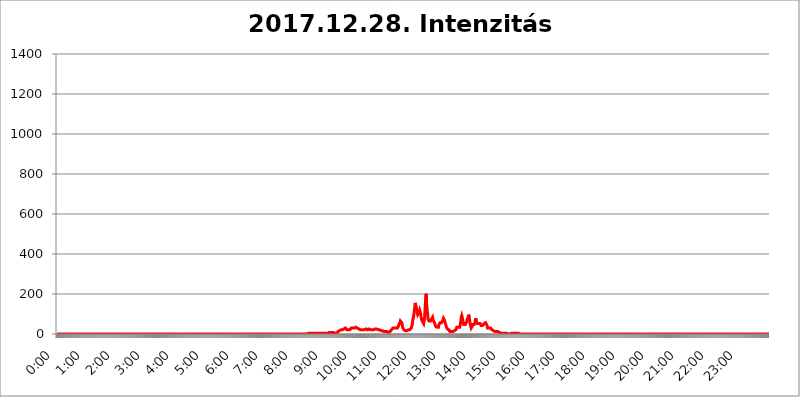
| Category | 2017.12.28. Intenzitás [W/m^2] |
|---|---|
| 0.0 | 0 |
| 0.0006944444444444445 | 0 |
| 0.001388888888888889 | 0 |
| 0.0020833333333333333 | 0 |
| 0.002777777777777778 | 0 |
| 0.003472222222222222 | 0 |
| 0.004166666666666667 | 0 |
| 0.004861111111111111 | 0 |
| 0.005555555555555556 | 0 |
| 0.0062499999999999995 | 0 |
| 0.006944444444444444 | 0 |
| 0.007638888888888889 | 0 |
| 0.008333333333333333 | 0 |
| 0.009027777777777779 | 0 |
| 0.009722222222222222 | 0 |
| 0.010416666666666666 | 0 |
| 0.011111111111111112 | 0 |
| 0.011805555555555555 | 0 |
| 0.012499999999999999 | 0 |
| 0.013194444444444444 | 0 |
| 0.013888888888888888 | 0 |
| 0.014583333333333332 | 0 |
| 0.015277777777777777 | 0 |
| 0.015972222222222224 | 0 |
| 0.016666666666666666 | 0 |
| 0.017361111111111112 | 0 |
| 0.018055555555555557 | 0 |
| 0.01875 | 0 |
| 0.019444444444444445 | 0 |
| 0.02013888888888889 | 0 |
| 0.020833333333333332 | 0 |
| 0.02152777777777778 | 0 |
| 0.022222222222222223 | 0 |
| 0.02291666666666667 | 0 |
| 0.02361111111111111 | 0 |
| 0.024305555555555556 | 0 |
| 0.024999999999999998 | 0 |
| 0.025694444444444447 | 0 |
| 0.02638888888888889 | 0 |
| 0.027083333333333334 | 0 |
| 0.027777777777777776 | 0 |
| 0.02847222222222222 | 0 |
| 0.029166666666666664 | 0 |
| 0.029861111111111113 | 0 |
| 0.030555555555555555 | 0 |
| 0.03125 | 0 |
| 0.03194444444444445 | 0 |
| 0.03263888888888889 | 0 |
| 0.03333333333333333 | 0 |
| 0.034027777777777775 | 0 |
| 0.034722222222222224 | 0 |
| 0.035416666666666666 | 0 |
| 0.036111111111111115 | 0 |
| 0.03680555555555556 | 0 |
| 0.0375 | 0 |
| 0.03819444444444444 | 0 |
| 0.03888888888888889 | 0 |
| 0.03958333333333333 | 0 |
| 0.04027777777777778 | 0 |
| 0.04097222222222222 | 0 |
| 0.041666666666666664 | 0 |
| 0.042361111111111106 | 0 |
| 0.04305555555555556 | 0 |
| 0.043750000000000004 | 0 |
| 0.044444444444444446 | 0 |
| 0.04513888888888889 | 0 |
| 0.04583333333333334 | 0 |
| 0.04652777777777778 | 0 |
| 0.04722222222222222 | 0 |
| 0.04791666666666666 | 0 |
| 0.04861111111111111 | 0 |
| 0.049305555555555554 | 0 |
| 0.049999999999999996 | 0 |
| 0.05069444444444445 | 0 |
| 0.051388888888888894 | 0 |
| 0.052083333333333336 | 0 |
| 0.05277777777777778 | 0 |
| 0.05347222222222222 | 0 |
| 0.05416666666666667 | 0 |
| 0.05486111111111111 | 0 |
| 0.05555555555555555 | 0 |
| 0.05625 | 0 |
| 0.05694444444444444 | 0 |
| 0.057638888888888885 | 0 |
| 0.05833333333333333 | 0 |
| 0.05902777777777778 | 0 |
| 0.059722222222222225 | 0 |
| 0.06041666666666667 | 0 |
| 0.061111111111111116 | 0 |
| 0.06180555555555556 | 0 |
| 0.0625 | 0 |
| 0.06319444444444444 | 0 |
| 0.06388888888888888 | 0 |
| 0.06458333333333334 | 0 |
| 0.06527777777777778 | 0 |
| 0.06597222222222222 | 0 |
| 0.06666666666666667 | 0 |
| 0.06736111111111111 | 0 |
| 0.06805555555555555 | 0 |
| 0.06874999999999999 | 0 |
| 0.06944444444444443 | 0 |
| 0.07013888888888889 | 0 |
| 0.07083333333333333 | 0 |
| 0.07152777777777779 | 0 |
| 0.07222222222222223 | 0 |
| 0.07291666666666667 | 0 |
| 0.07361111111111111 | 0 |
| 0.07430555555555556 | 0 |
| 0.075 | 0 |
| 0.07569444444444444 | 0 |
| 0.0763888888888889 | 0 |
| 0.07708333333333334 | 0 |
| 0.07777777777777778 | 0 |
| 0.07847222222222222 | 0 |
| 0.07916666666666666 | 0 |
| 0.0798611111111111 | 0 |
| 0.08055555555555556 | 0 |
| 0.08125 | 0 |
| 0.08194444444444444 | 0 |
| 0.08263888888888889 | 0 |
| 0.08333333333333333 | 0 |
| 0.08402777777777777 | 0 |
| 0.08472222222222221 | 0 |
| 0.08541666666666665 | 0 |
| 0.08611111111111112 | 0 |
| 0.08680555555555557 | 0 |
| 0.08750000000000001 | 0 |
| 0.08819444444444445 | 0 |
| 0.08888888888888889 | 0 |
| 0.08958333333333333 | 0 |
| 0.09027777777777778 | 0 |
| 0.09097222222222222 | 0 |
| 0.09166666666666667 | 0 |
| 0.09236111111111112 | 0 |
| 0.09305555555555556 | 0 |
| 0.09375 | 0 |
| 0.09444444444444444 | 0 |
| 0.09513888888888888 | 0 |
| 0.09583333333333333 | 0 |
| 0.09652777777777777 | 0 |
| 0.09722222222222222 | 0 |
| 0.09791666666666667 | 0 |
| 0.09861111111111111 | 0 |
| 0.09930555555555555 | 0 |
| 0.09999999999999999 | 0 |
| 0.10069444444444443 | 0 |
| 0.1013888888888889 | 0 |
| 0.10208333333333335 | 0 |
| 0.10277777777777779 | 0 |
| 0.10347222222222223 | 0 |
| 0.10416666666666667 | 0 |
| 0.10486111111111111 | 0 |
| 0.10555555555555556 | 0 |
| 0.10625 | 0 |
| 0.10694444444444444 | 0 |
| 0.1076388888888889 | 0 |
| 0.10833333333333334 | 0 |
| 0.10902777777777778 | 0 |
| 0.10972222222222222 | 0 |
| 0.1111111111111111 | 0 |
| 0.11180555555555556 | 0 |
| 0.11180555555555556 | 0 |
| 0.1125 | 0 |
| 0.11319444444444444 | 0 |
| 0.11388888888888889 | 0 |
| 0.11458333333333333 | 0 |
| 0.11527777777777777 | 0 |
| 0.11597222222222221 | 0 |
| 0.11666666666666665 | 0 |
| 0.1173611111111111 | 0 |
| 0.11805555555555557 | 0 |
| 0.11944444444444445 | 0 |
| 0.12013888888888889 | 0 |
| 0.12083333333333333 | 0 |
| 0.12152777777777778 | 0 |
| 0.12222222222222223 | 0 |
| 0.12291666666666667 | 0 |
| 0.12291666666666667 | 0 |
| 0.12361111111111112 | 0 |
| 0.12430555555555556 | 0 |
| 0.125 | 0 |
| 0.12569444444444444 | 0 |
| 0.12638888888888888 | 0 |
| 0.12708333333333333 | 0 |
| 0.16875 | 0 |
| 0.12847222222222224 | 0 |
| 0.12916666666666668 | 0 |
| 0.12986111111111112 | 0 |
| 0.13055555555555556 | 0 |
| 0.13125 | 0 |
| 0.13194444444444445 | 0 |
| 0.1326388888888889 | 0 |
| 0.13333333333333333 | 0 |
| 0.13402777777777777 | 0 |
| 0.13402777777777777 | 0 |
| 0.13472222222222222 | 0 |
| 0.13541666666666666 | 0 |
| 0.1361111111111111 | 0 |
| 0.13749999999999998 | 0 |
| 0.13819444444444443 | 0 |
| 0.1388888888888889 | 0 |
| 0.13958333333333334 | 0 |
| 0.14027777777777778 | 0 |
| 0.14097222222222222 | 0 |
| 0.14166666666666666 | 0 |
| 0.1423611111111111 | 0 |
| 0.14305555555555557 | 0 |
| 0.14375000000000002 | 0 |
| 0.14444444444444446 | 0 |
| 0.1451388888888889 | 0 |
| 0.1451388888888889 | 0 |
| 0.14652777777777778 | 0 |
| 0.14722222222222223 | 0 |
| 0.14791666666666667 | 0 |
| 0.1486111111111111 | 0 |
| 0.14930555555555555 | 0 |
| 0.15 | 0 |
| 0.15069444444444444 | 0 |
| 0.15138888888888888 | 0 |
| 0.15208333333333332 | 0 |
| 0.15277777777777776 | 0 |
| 0.15347222222222223 | 0 |
| 0.15416666666666667 | 0 |
| 0.15486111111111112 | 0 |
| 0.15555555555555556 | 0 |
| 0.15625 | 0 |
| 0.15694444444444444 | 0 |
| 0.15763888888888888 | 0 |
| 0.15833333333333333 | 0 |
| 0.15902777777777777 | 0 |
| 0.15972222222222224 | 0 |
| 0.16041666666666668 | 0 |
| 0.16111111111111112 | 0 |
| 0.16180555555555556 | 0 |
| 0.1625 | 0 |
| 0.16319444444444445 | 0 |
| 0.1638888888888889 | 0 |
| 0.16458333333333333 | 0 |
| 0.16527777777777777 | 0 |
| 0.16597222222222222 | 0 |
| 0.16666666666666666 | 0 |
| 0.1673611111111111 | 0 |
| 0.16805555555555554 | 0 |
| 0.16874999999999998 | 0 |
| 0.16944444444444443 | 0 |
| 0.17013888888888887 | 0 |
| 0.1708333333333333 | 0 |
| 0.17152777777777775 | 0 |
| 0.17222222222222225 | 0 |
| 0.1729166666666667 | 0 |
| 0.17361111111111113 | 0 |
| 0.17430555555555557 | 0 |
| 0.17500000000000002 | 0 |
| 0.17569444444444446 | 0 |
| 0.1763888888888889 | 0 |
| 0.17708333333333334 | 0 |
| 0.17777777777777778 | 0 |
| 0.17847222222222223 | 0 |
| 0.17916666666666667 | 0 |
| 0.1798611111111111 | 0 |
| 0.18055555555555555 | 0 |
| 0.18125 | 0 |
| 0.18194444444444444 | 0 |
| 0.1826388888888889 | 0 |
| 0.18333333333333335 | 0 |
| 0.1840277777777778 | 0 |
| 0.18472222222222223 | 0 |
| 0.18541666666666667 | 0 |
| 0.18611111111111112 | 0 |
| 0.18680555555555556 | 0 |
| 0.1875 | 0 |
| 0.18819444444444444 | 0 |
| 0.18888888888888888 | 0 |
| 0.18958333333333333 | 0 |
| 0.19027777777777777 | 0 |
| 0.1909722222222222 | 0 |
| 0.19166666666666665 | 0 |
| 0.19236111111111112 | 0 |
| 0.19305555555555554 | 0 |
| 0.19375 | 0 |
| 0.19444444444444445 | 0 |
| 0.1951388888888889 | 0 |
| 0.19583333333333333 | 0 |
| 0.19652777777777777 | 0 |
| 0.19722222222222222 | 0 |
| 0.19791666666666666 | 0 |
| 0.1986111111111111 | 0 |
| 0.19930555555555554 | 0 |
| 0.19999999999999998 | 0 |
| 0.20069444444444443 | 0 |
| 0.20138888888888887 | 0 |
| 0.2020833333333333 | 0 |
| 0.2027777777777778 | 0 |
| 0.2034722222222222 | 0 |
| 0.2041666666666667 | 0 |
| 0.20486111111111113 | 0 |
| 0.20555555555555557 | 0 |
| 0.20625000000000002 | 0 |
| 0.20694444444444446 | 0 |
| 0.2076388888888889 | 0 |
| 0.20833333333333334 | 0 |
| 0.20902777777777778 | 0 |
| 0.20972222222222223 | 0 |
| 0.21041666666666667 | 0 |
| 0.2111111111111111 | 0 |
| 0.21180555555555555 | 0 |
| 0.2125 | 0 |
| 0.21319444444444444 | 0 |
| 0.2138888888888889 | 0 |
| 0.21458333333333335 | 0 |
| 0.2152777777777778 | 0 |
| 0.21597222222222223 | 0 |
| 0.21666666666666667 | 0 |
| 0.21736111111111112 | 0 |
| 0.21805555555555556 | 0 |
| 0.21875 | 0 |
| 0.21944444444444444 | 0 |
| 0.22013888888888888 | 0 |
| 0.22083333333333333 | 0 |
| 0.22152777777777777 | 0 |
| 0.2222222222222222 | 0 |
| 0.22291666666666665 | 0 |
| 0.2236111111111111 | 0 |
| 0.22430555555555556 | 0 |
| 0.225 | 0 |
| 0.22569444444444445 | 0 |
| 0.2263888888888889 | 0 |
| 0.22708333333333333 | 0 |
| 0.22777777777777777 | 0 |
| 0.22847222222222222 | 0 |
| 0.22916666666666666 | 0 |
| 0.2298611111111111 | 0 |
| 0.23055555555555554 | 0 |
| 0.23124999999999998 | 0 |
| 0.23194444444444443 | 0 |
| 0.23263888888888887 | 0 |
| 0.2333333333333333 | 0 |
| 0.2340277777777778 | 0 |
| 0.2347222222222222 | 0 |
| 0.2354166666666667 | 0 |
| 0.23611111111111113 | 0 |
| 0.23680555555555557 | 0 |
| 0.23750000000000002 | 0 |
| 0.23819444444444446 | 0 |
| 0.2388888888888889 | 0 |
| 0.23958333333333334 | 0 |
| 0.24027777777777778 | 0 |
| 0.24097222222222223 | 0 |
| 0.24166666666666667 | 0 |
| 0.2423611111111111 | 0 |
| 0.24305555555555555 | 0 |
| 0.24375 | 0 |
| 0.24444444444444446 | 0 |
| 0.24513888888888888 | 0 |
| 0.24583333333333335 | 0 |
| 0.2465277777777778 | 0 |
| 0.24722222222222223 | 0 |
| 0.24791666666666667 | 0 |
| 0.24861111111111112 | 0 |
| 0.24930555555555556 | 0 |
| 0.25 | 0 |
| 0.25069444444444444 | 0 |
| 0.2513888888888889 | 0 |
| 0.2520833333333333 | 0 |
| 0.25277777777777777 | 0 |
| 0.2534722222222222 | 0 |
| 0.25416666666666665 | 0 |
| 0.2548611111111111 | 0 |
| 0.2555555555555556 | 0 |
| 0.25625000000000003 | 0 |
| 0.2569444444444445 | 0 |
| 0.2576388888888889 | 0 |
| 0.25833333333333336 | 0 |
| 0.2590277777777778 | 0 |
| 0.25972222222222224 | 0 |
| 0.2604166666666667 | 0 |
| 0.2611111111111111 | 0 |
| 0.26180555555555557 | 0 |
| 0.2625 | 0 |
| 0.26319444444444445 | 0 |
| 0.2638888888888889 | 0 |
| 0.26458333333333334 | 0 |
| 0.2652777777777778 | 0 |
| 0.2659722222222222 | 0 |
| 0.26666666666666666 | 0 |
| 0.2673611111111111 | 0 |
| 0.26805555555555555 | 0 |
| 0.26875 | 0 |
| 0.26944444444444443 | 0 |
| 0.2701388888888889 | 0 |
| 0.2708333333333333 | 0 |
| 0.27152777777777776 | 0 |
| 0.2722222222222222 | 0 |
| 0.27291666666666664 | 0 |
| 0.2736111111111111 | 0 |
| 0.2743055555555555 | 0 |
| 0.27499999999999997 | 0 |
| 0.27569444444444446 | 0 |
| 0.27638888888888885 | 0 |
| 0.27708333333333335 | 0 |
| 0.2777777777777778 | 0 |
| 0.27847222222222223 | 0 |
| 0.2791666666666667 | 0 |
| 0.2798611111111111 | 0 |
| 0.28055555555555556 | 0 |
| 0.28125 | 0 |
| 0.28194444444444444 | 0 |
| 0.2826388888888889 | 0 |
| 0.2833333333333333 | 0 |
| 0.28402777777777777 | 0 |
| 0.2847222222222222 | 0 |
| 0.28541666666666665 | 0 |
| 0.28611111111111115 | 0 |
| 0.28680555555555554 | 0 |
| 0.28750000000000003 | 0 |
| 0.2881944444444445 | 0 |
| 0.2888888888888889 | 0 |
| 0.28958333333333336 | 0 |
| 0.2902777777777778 | 0 |
| 0.29097222222222224 | 0 |
| 0.2916666666666667 | 0 |
| 0.2923611111111111 | 0 |
| 0.29305555555555557 | 0 |
| 0.29375 | 0 |
| 0.29444444444444445 | 0 |
| 0.2951388888888889 | 0 |
| 0.29583333333333334 | 0 |
| 0.2965277777777778 | 0 |
| 0.2972222222222222 | 0 |
| 0.29791666666666666 | 0 |
| 0.2986111111111111 | 0 |
| 0.29930555555555555 | 0 |
| 0.3 | 0 |
| 0.30069444444444443 | 0 |
| 0.3013888888888889 | 0 |
| 0.3020833333333333 | 0 |
| 0.30277777777777776 | 0 |
| 0.3034722222222222 | 0 |
| 0.30416666666666664 | 0 |
| 0.3048611111111111 | 0 |
| 0.3055555555555555 | 0 |
| 0.30624999999999997 | 0 |
| 0.3069444444444444 | 0 |
| 0.3076388888888889 | 0 |
| 0.30833333333333335 | 0 |
| 0.3090277777777778 | 0 |
| 0.30972222222222223 | 0 |
| 0.3104166666666667 | 0 |
| 0.3111111111111111 | 0 |
| 0.31180555555555556 | 0 |
| 0.3125 | 0 |
| 0.31319444444444444 | 0 |
| 0.3138888888888889 | 0 |
| 0.3145833333333333 | 0 |
| 0.31527777777777777 | 0 |
| 0.3159722222222222 | 0 |
| 0.31666666666666665 | 0 |
| 0.31736111111111115 | 0 |
| 0.31805555555555554 | 0 |
| 0.31875000000000003 | 0 |
| 0.3194444444444445 | 0 |
| 0.3201388888888889 | 0 |
| 0.32083333333333336 | 0 |
| 0.3215277777777778 | 0 |
| 0.32222222222222224 | 0 |
| 0.3229166666666667 | 0 |
| 0.3236111111111111 | 0 |
| 0.32430555555555557 | 0 |
| 0.325 | 0 |
| 0.32569444444444445 | 0 |
| 0.3263888888888889 | 0 |
| 0.32708333333333334 | 0 |
| 0.3277777777777778 | 0 |
| 0.3284722222222222 | 0 |
| 0.32916666666666666 | 0 |
| 0.3298611111111111 | 0 |
| 0.33055555555555555 | 0 |
| 0.33125 | 0 |
| 0.33194444444444443 | 0 |
| 0.3326388888888889 | 0 |
| 0.3333333333333333 | 0 |
| 0.3340277777777778 | 0 |
| 0.3347222222222222 | 0 |
| 0.3354166666666667 | 0 |
| 0.3361111111111111 | 0 |
| 0.3368055555555556 | 0 |
| 0.33749999999999997 | 0 |
| 0.33819444444444446 | 0 |
| 0.33888888888888885 | 0 |
| 0.33958333333333335 | 0 |
| 0.34027777777777773 | 0 |
| 0.34097222222222223 | 0 |
| 0.3416666666666666 | 0 |
| 0.3423611111111111 | 0 |
| 0.3430555555555555 | 0 |
| 0.34375 | 0 |
| 0.3444444444444445 | 0 |
| 0.3451388888888889 | 0 |
| 0.3458333333333334 | 0 |
| 0.34652777777777777 | 0 |
| 0.34722222222222227 | 0 |
| 0.34791666666666665 | 0 |
| 0.34861111111111115 | 0 |
| 0.34930555555555554 | 0 |
| 0.35000000000000003 | 0 |
| 0.3506944444444444 | 0 |
| 0.3513888888888889 | 0 |
| 0.3520833333333333 | 3.525 |
| 0.3527777777777778 | 3.525 |
| 0.3534722222222222 | 3.525 |
| 0.3541666666666667 | 3.525 |
| 0.3548611111111111 | 3.525 |
| 0.35555555555555557 | 3.525 |
| 0.35625 | 3.525 |
| 0.35694444444444445 | 3.525 |
| 0.3576388888888889 | 3.525 |
| 0.35833333333333334 | 3.525 |
| 0.3590277777777778 | 3.525 |
| 0.3597222222222222 | 3.525 |
| 0.36041666666666666 | 3.525 |
| 0.3611111111111111 | 3.525 |
| 0.36180555555555555 | 3.525 |
| 0.3625 | 3.525 |
| 0.36319444444444443 | 3.525 |
| 0.3638888888888889 | 3.525 |
| 0.3645833333333333 | 3.525 |
| 0.3652777777777778 | 3.525 |
| 0.3659722222222222 | 3.525 |
| 0.3666666666666667 | 3.525 |
| 0.3673611111111111 | 3.525 |
| 0.3680555555555556 | 3.525 |
| 0.36874999999999997 | 3.525 |
| 0.36944444444444446 | 3.525 |
| 0.37013888888888885 | 3.525 |
| 0.37083333333333335 | 3.525 |
| 0.37152777777777773 | 3.525 |
| 0.37222222222222223 | 3.525 |
| 0.3729166666666666 | 3.525 |
| 0.3736111111111111 | 3.525 |
| 0.3743055555555555 | 3.525 |
| 0.375 | 3.525 |
| 0.3756944444444445 | 7.887 |
| 0.3763888888888889 | 3.525 |
| 0.3770833333333334 | 3.525 |
| 0.37777777777777777 | 3.525 |
| 0.37847222222222227 | 3.525 |
| 0.37916666666666665 | 3.525 |
| 0.37986111111111115 | 3.525 |
| 0.38055555555555554 | 7.887 |
| 0.38125000000000003 | 7.887 |
| 0.3819444444444444 | 7.887 |
| 0.3826388888888889 | 7.887 |
| 0.3833333333333333 | 7.887 |
| 0.3840277777777778 | 7.887 |
| 0.3847222222222222 | 7.887 |
| 0.3854166666666667 | 7.887 |
| 0.3861111111111111 | 7.887 |
| 0.38680555555555557 | 7.887 |
| 0.3875 | 7.887 |
| 0.38819444444444445 | 7.887 |
| 0.3888888888888889 | 3.525 |
| 0.38958333333333334 | 3.525 |
| 0.3902777777777778 | 3.525 |
| 0.3909722222222222 | 3.525 |
| 0.39166666666666666 | 3.525 |
| 0.3923611111111111 | 3.525 |
| 0.39305555555555555 | 7.887 |
| 0.39375 | 12.257 |
| 0.39444444444444443 | 12.257 |
| 0.3951388888888889 | 12.257 |
| 0.3958333333333333 | 16.636 |
| 0.3965277777777778 | 16.636 |
| 0.3972222222222222 | 16.636 |
| 0.3979166666666667 | 21.024 |
| 0.3986111111111111 | 21.024 |
| 0.3993055555555556 | 21.024 |
| 0.39999999999999997 | 21.024 |
| 0.40069444444444446 | 21.024 |
| 0.40138888888888885 | 25.419 |
| 0.40208333333333335 | 25.419 |
| 0.40277777777777773 | 29.823 |
| 0.40347222222222223 | 29.823 |
| 0.4041666666666666 | 29.823 |
| 0.4048611111111111 | 25.419 |
| 0.4055555555555555 | 25.419 |
| 0.40625 | 21.024 |
| 0.4069444444444445 | 21.024 |
| 0.4076388888888889 | 21.024 |
| 0.4083333333333334 | 21.024 |
| 0.40902777777777777 | 21.024 |
| 0.40972222222222227 | 21.024 |
| 0.41041666666666665 | 21.024 |
| 0.41111111111111115 | 25.419 |
| 0.41180555555555554 | 25.419 |
| 0.41250000000000003 | 29.823 |
| 0.4131944444444444 | 29.823 |
| 0.4138888888888889 | 29.823 |
| 0.4145833333333333 | 29.823 |
| 0.4152777777777778 | 34.234 |
| 0.4159722222222222 | 34.234 |
| 0.4166666666666667 | 29.823 |
| 0.4173611111111111 | 29.823 |
| 0.41805555555555557 | 34.234 |
| 0.41875 | 34.234 |
| 0.41944444444444445 | 34.234 |
| 0.4201388888888889 | 34.234 |
| 0.42083333333333334 | 29.823 |
| 0.4215277777777778 | 29.823 |
| 0.4222222222222222 | 25.419 |
| 0.42291666666666666 | 25.419 |
| 0.4236111111111111 | 25.419 |
| 0.42430555555555555 | 21.024 |
| 0.425 | 21.024 |
| 0.42569444444444443 | 21.024 |
| 0.4263888888888889 | 21.024 |
| 0.4270833333333333 | 21.024 |
| 0.4277777777777778 | 21.024 |
| 0.4284722222222222 | 21.024 |
| 0.4291666666666667 | 21.024 |
| 0.4298611111111111 | 21.024 |
| 0.4305555555555556 | 16.636 |
| 0.43124999999999997 | 21.024 |
| 0.43194444444444446 | 21.024 |
| 0.43263888888888885 | 21.024 |
| 0.43333333333333335 | 25.419 |
| 0.43402777777777773 | 25.419 |
| 0.43472222222222223 | 25.419 |
| 0.4354166666666666 | 21.024 |
| 0.4361111111111111 | 25.419 |
| 0.4368055555555555 | 25.419 |
| 0.4375 | 25.419 |
| 0.4381944444444445 | 25.419 |
| 0.4388888888888889 | 25.419 |
| 0.4395833333333334 | 21.024 |
| 0.44027777777777777 | 21.024 |
| 0.44097222222222227 | 25.419 |
| 0.44166666666666665 | 21.024 |
| 0.44236111111111115 | 21.024 |
| 0.44305555555555554 | 21.024 |
| 0.44375000000000003 | 21.024 |
| 0.4444444444444444 | 21.024 |
| 0.4451388888888889 | 25.419 |
| 0.4458333333333333 | 25.419 |
| 0.4465277777777778 | 25.419 |
| 0.4472222222222222 | 25.419 |
| 0.4479166666666667 | 25.419 |
| 0.4486111111111111 | 21.024 |
| 0.44930555555555557 | 21.024 |
| 0.45 | 21.024 |
| 0.45069444444444445 | 21.024 |
| 0.4513888888888889 | 21.024 |
| 0.45208333333333334 | 21.024 |
| 0.4527777777777778 | 21.024 |
| 0.4534722222222222 | 21.024 |
| 0.45416666666666666 | 16.636 |
| 0.4548611111111111 | 16.636 |
| 0.45555555555555555 | 12.257 |
| 0.45625 | 16.636 |
| 0.45694444444444443 | 16.636 |
| 0.4576388888888889 | 12.257 |
| 0.4583333333333333 | 12.257 |
| 0.4590277777777778 | 12.257 |
| 0.4597222222222222 | 12.257 |
| 0.4604166666666667 | 12.257 |
| 0.4611111111111111 | 12.257 |
| 0.4618055555555556 | 12.257 |
| 0.46249999999999997 | 12.257 |
| 0.46319444444444446 | 7.887 |
| 0.46388888888888885 | 7.887 |
| 0.46458333333333335 | 7.887 |
| 0.46527777777777773 | 12.257 |
| 0.46597222222222223 | 12.257 |
| 0.4666666666666666 | 12.257 |
| 0.4673611111111111 | 16.636 |
| 0.4680555555555555 | 16.636 |
| 0.46875 | 21.024 |
| 0.4694444444444445 | 21.024 |
| 0.4701388888888889 | 25.419 |
| 0.4708333333333334 | 29.823 |
| 0.47152777777777777 | 29.823 |
| 0.47222222222222227 | 29.823 |
| 0.47291666666666665 | 29.823 |
| 0.47361111111111115 | 29.823 |
| 0.47430555555555554 | 29.823 |
| 0.47500000000000003 | 29.823 |
| 0.4756944444444444 | 29.823 |
| 0.4763888888888889 | 29.823 |
| 0.4770833333333333 | 29.823 |
| 0.4777777777777778 | 34.234 |
| 0.4784722222222222 | 38.653 |
| 0.4791666666666667 | 47.511 |
| 0.4798611111111111 | 51.951 |
| 0.48055555555555557 | 56.398 |
| 0.48125 | 65.31 |
| 0.48194444444444445 | 69.775 |
| 0.4826388888888889 | 69.775 |
| 0.48333333333333334 | 56.398 |
| 0.4840277777777778 | 43.079 |
| 0.4847222222222222 | 29.823 |
| 0.48541666666666666 | 25.419 |
| 0.4861111111111111 | 21.024 |
| 0.48680555555555555 | 21.024 |
| 0.4875 | 16.636 |
| 0.48819444444444443 | 16.636 |
| 0.4888888888888889 | 16.636 |
| 0.4895833333333333 | 12.257 |
| 0.4902777777777778 | 16.636 |
| 0.4909722222222222 | 16.636 |
| 0.4916666666666667 | 16.636 |
| 0.4923611111111111 | 21.024 |
| 0.4930555555555556 | 21.024 |
| 0.49374999999999997 | 21.024 |
| 0.49444444444444446 | 21.024 |
| 0.49513888888888885 | 21.024 |
| 0.49583333333333335 | 25.419 |
| 0.49652777777777773 | 29.823 |
| 0.49722222222222223 | 29.823 |
| 0.4979166666666666 | 47.511 |
| 0.4986111111111111 | 69.775 |
| 0.4993055555555555 | 78.722 |
| 0.5 | 92.184 |
| 0.5006944444444444 | 110.201 |
| 0.5013888888888889 | 137.347 |
| 0.5020833333333333 | 155.509 |
| 0.5027777777777778 | 160.056 |
| 0.5034722222222222 | 155.509 |
| 0.5041666666666667 | 119.235 |
| 0.5048611111111111 | 105.69 |
| 0.5055555555555555 | 96.682 |
| 0.50625 | 92.184 |
| 0.5069444444444444 | 92.184 |
| 0.5076388888888889 | 110.201 |
| 0.5083333333333333 | 119.235 |
| 0.5090277777777777 | 114.716 |
| 0.5097222222222222 | 101.184 |
| 0.5104166666666666 | 83.205 |
| 0.5111111111111112 | 69.775 |
| 0.5118055555555555 | 65.31 |
| 0.5125000000000001 | 60.85 |
| 0.5131944444444444 | 56.398 |
| 0.513888888888889 | 51.951 |
| 0.5145833333333333 | 56.398 |
| 0.5152777777777778 | 83.205 |
| 0.5159722222222222 | 132.814 |
| 0.5166666666666667 | 173.709 |
| 0.517361111111111 | 201.058 |
| 0.5180555555555556 | 150.964 |
| 0.5187499999999999 | 123.758 |
| 0.5194444444444445 | 96.682 |
| 0.5201388888888888 | 74.246 |
| 0.5208333333333334 | 69.775 |
| 0.5215277777777778 | 65.31 |
| 0.5222222222222223 | 65.31 |
| 0.5229166666666667 | 65.31 |
| 0.5236111111111111 | 65.31 |
| 0.5243055555555556 | 69.775 |
| 0.525 | 74.246 |
| 0.5256944444444445 | 78.722 |
| 0.5263888888888889 | 83.205 |
| 0.5270833333333333 | 69.775 |
| 0.5277777777777778 | 65.31 |
| 0.5284722222222222 | 65.31 |
| 0.5291666666666667 | 56.398 |
| 0.5298611111111111 | 47.511 |
| 0.5305555555555556 | 38.653 |
| 0.53125 | 34.234 |
| 0.5319444444444444 | 34.234 |
| 0.5326388888888889 | 34.234 |
| 0.5333333333333333 | 34.234 |
| 0.5340277777777778 | 29.823 |
| 0.5347222222222222 | 34.234 |
| 0.5354166666666667 | 47.511 |
| 0.5361111111111111 | 51.951 |
| 0.5368055555555555 | 56.398 |
| 0.5375 | 56.398 |
| 0.5381944444444444 | 56.398 |
| 0.5388888888888889 | 56.398 |
| 0.5395833333333333 | 56.398 |
| 0.5402777777777777 | 60.85 |
| 0.5409722222222222 | 69.775 |
| 0.5416666666666666 | 78.722 |
| 0.5423611111111112 | 74.246 |
| 0.5430555555555555 | 69.775 |
| 0.5437500000000001 | 65.31 |
| 0.5444444444444444 | 51.951 |
| 0.545138888888889 | 43.079 |
| 0.5458333333333333 | 34.234 |
| 0.5465277777777778 | 29.823 |
| 0.5472222222222222 | 25.419 |
| 0.5479166666666667 | 25.419 |
| 0.548611111111111 | 21.024 |
| 0.5493055555555556 | 21.024 |
| 0.5499999999999999 | 16.636 |
| 0.5506944444444445 | 12.257 |
| 0.5513888888888888 | 12.257 |
| 0.5520833333333334 | 12.257 |
| 0.5527777777777778 | 12.257 |
| 0.5534722222222223 | 12.257 |
| 0.5541666666666667 | 12.257 |
| 0.5548611111111111 | 12.257 |
| 0.5555555555555556 | 16.636 |
| 0.55625 | 16.636 |
| 0.5569444444444445 | 16.636 |
| 0.5576388888888889 | 16.636 |
| 0.5583333333333333 | 16.636 |
| 0.5590277777777778 | 21.024 |
| 0.5597222222222222 | 25.419 |
| 0.5604166666666667 | 34.234 |
| 0.5611111111111111 | 34.234 |
| 0.5618055555555556 | 38.653 |
| 0.5625 | 34.234 |
| 0.5631944444444444 | 29.823 |
| 0.5638888888888889 | 29.823 |
| 0.5645833333333333 | 34.234 |
| 0.5652777777777778 | 47.511 |
| 0.5659722222222222 | 65.31 |
| 0.5666666666666667 | 83.205 |
| 0.5673611111111111 | 92.184 |
| 0.5680555555555555 | 83.205 |
| 0.56875 | 69.775 |
| 0.5694444444444444 | 56.398 |
| 0.5701388888888889 | 47.511 |
| 0.5708333333333333 | 43.079 |
| 0.5715277777777777 | 43.079 |
| 0.5722222222222222 | 47.511 |
| 0.5729166666666666 | 47.511 |
| 0.5736111111111112 | 47.511 |
| 0.5743055555555555 | 60.85 |
| 0.5750000000000001 | 74.246 |
| 0.5756944444444444 | 74.246 |
| 0.576388888888889 | 83.205 |
| 0.5770833333333333 | 96.682 |
| 0.5777777777777778 | 83.205 |
| 0.5784722222222222 | 65.31 |
| 0.5791666666666667 | 51.951 |
| 0.579861111111111 | 38.653 |
| 0.5805555555555556 | 29.823 |
| 0.5812499999999999 | 29.823 |
| 0.5819444444444445 | 38.653 |
| 0.5826388888888888 | 47.511 |
| 0.5833333333333334 | 51.951 |
| 0.5840277777777778 | 51.951 |
| 0.5847222222222223 | 47.511 |
| 0.5854166666666667 | 51.951 |
| 0.5861111111111111 | 60.85 |
| 0.5868055555555556 | 78.722 |
| 0.5875 | 78.722 |
| 0.5881944444444445 | 60.85 |
| 0.5888888888888889 | 51.951 |
| 0.5895833333333333 | 47.511 |
| 0.5902777777777778 | 51.951 |
| 0.5909722222222222 | 51.951 |
| 0.5916666666666667 | 51.951 |
| 0.5923611111111111 | 51.951 |
| 0.5930555555555556 | 51.951 |
| 0.59375 | 47.511 |
| 0.5944444444444444 | 43.079 |
| 0.5951388888888889 | 43.079 |
| 0.5958333333333333 | 43.079 |
| 0.5965277777777778 | 43.079 |
| 0.5972222222222222 | 47.511 |
| 0.5979166666666667 | 47.511 |
| 0.5986111111111111 | 51.951 |
| 0.5993055555555555 | 56.398 |
| 0.6 | 56.398 |
| 0.6006944444444444 | 56.398 |
| 0.6013888888888889 | 56.398 |
| 0.6020833333333333 | 51.951 |
| 0.6027777777777777 | 43.079 |
| 0.6034722222222222 | 29.823 |
| 0.6041666666666666 | 25.419 |
| 0.6048611111111112 | 29.823 |
| 0.6055555555555555 | 29.823 |
| 0.6062500000000001 | 29.823 |
| 0.6069444444444444 | 34.234 |
| 0.607638888888889 | 29.823 |
| 0.6083333333333333 | 29.823 |
| 0.6090277777777778 | 25.419 |
| 0.6097222222222222 | 21.024 |
| 0.6104166666666667 | 21.024 |
| 0.611111111111111 | 16.636 |
| 0.6118055555555556 | 16.636 |
| 0.6124999999999999 | 16.636 |
| 0.6131944444444445 | 12.257 |
| 0.6138888888888888 | 12.257 |
| 0.6145833333333334 | 12.257 |
| 0.6152777777777778 | 12.257 |
| 0.6159722222222223 | 12.257 |
| 0.6166666666666667 | 12.257 |
| 0.6173611111111111 | 12.257 |
| 0.6180555555555556 | 12.257 |
| 0.61875 | 7.887 |
| 0.6194444444444445 | 7.887 |
| 0.6201388888888889 | 7.887 |
| 0.6208333333333333 | 3.525 |
| 0.6215277777777778 | 3.525 |
| 0.6222222222222222 | 3.525 |
| 0.6229166666666667 | 3.525 |
| 0.6236111111111111 | 3.525 |
| 0.6243055555555556 | 3.525 |
| 0.625 | 3.525 |
| 0.6256944444444444 | 3.525 |
| 0.6263888888888889 | 3.525 |
| 0.6270833333333333 | 3.525 |
| 0.6277777777777778 | 3.525 |
| 0.6284722222222222 | 3.525 |
| 0.6291666666666667 | 3.525 |
| 0.6298611111111111 | 3.525 |
| 0.6305555555555555 | 3.525 |
| 0.63125 | 3.525 |
| 0.6319444444444444 | 0 |
| 0.6326388888888889 | 0 |
| 0.6333333333333333 | 0 |
| 0.6340277777777777 | 0 |
| 0.6347222222222222 | 0 |
| 0.6354166666666666 | 0 |
| 0.6361111111111112 | 3.525 |
| 0.6368055555555555 | 3.525 |
| 0.6375000000000001 | 3.525 |
| 0.6381944444444444 | 3.525 |
| 0.638888888888889 | 3.525 |
| 0.6395833333333333 | 3.525 |
| 0.6402777777777778 | 3.525 |
| 0.6409722222222222 | 3.525 |
| 0.6416666666666667 | 3.525 |
| 0.642361111111111 | 3.525 |
| 0.6430555555555556 | 3.525 |
| 0.6437499999999999 | 3.525 |
| 0.6444444444444445 | 3.525 |
| 0.6451388888888888 | 3.525 |
| 0.6458333333333334 | 3.525 |
| 0.6465277777777778 | 3.525 |
| 0.6472222222222223 | 3.525 |
| 0.6479166666666667 | 3.525 |
| 0.6486111111111111 | 0 |
| 0.6493055555555556 | 0 |
| 0.65 | 0 |
| 0.6506944444444445 | 0 |
| 0.6513888888888889 | 0 |
| 0.6520833333333333 | 0 |
| 0.6527777777777778 | 0 |
| 0.6534722222222222 | 0 |
| 0.6541666666666667 | 0 |
| 0.6548611111111111 | 0 |
| 0.6555555555555556 | 0 |
| 0.65625 | 0 |
| 0.6569444444444444 | 0 |
| 0.6576388888888889 | 0 |
| 0.6583333333333333 | 0 |
| 0.6590277777777778 | 0 |
| 0.6597222222222222 | 0 |
| 0.6604166666666667 | 0 |
| 0.6611111111111111 | 0 |
| 0.6618055555555555 | 0 |
| 0.6625 | 0 |
| 0.6631944444444444 | 0 |
| 0.6638888888888889 | 0 |
| 0.6645833333333333 | 0 |
| 0.6652777777777777 | 0 |
| 0.6659722222222222 | 0 |
| 0.6666666666666666 | 0 |
| 0.6673611111111111 | 0 |
| 0.6680555555555556 | 0 |
| 0.6687500000000001 | 0 |
| 0.6694444444444444 | 0 |
| 0.6701388888888888 | 0 |
| 0.6708333333333334 | 0 |
| 0.6715277777777778 | 0 |
| 0.6722222222222222 | 0 |
| 0.6729166666666666 | 0 |
| 0.6736111111111112 | 0 |
| 0.6743055555555556 | 0 |
| 0.6749999999999999 | 0 |
| 0.6756944444444444 | 0 |
| 0.6763888888888889 | 0 |
| 0.6770833333333334 | 0 |
| 0.6777777777777777 | 0 |
| 0.6784722222222223 | 0 |
| 0.6791666666666667 | 0 |
| 0.6798611111111111 | 0 |
| 0.6805555555555555 | 0 |
| 0.68125 | 0 |
| 0.6819444444444445 | 0 |
| 0.6826388888888889 | 0 |
| 0.6833333333333332 | 0 |
| 0.6840277777777778 | 0 |
| 0.6847222222222222 | 0 |
| 0.6854166666666667 | 0 |
| 0.686111111111111 | 0 |
| 0.6868055555555556 | 0 |
| 0.6875 | 0 |
| 0.6881944444444444 | 0 |
| 0.688888888888889 | 0 |
| 0.6895833333333333 | 0 |
| 0.6902777777777778 | 0 |
| 0.6909722222222222 | 0 |
| 0.6916666666666668 | 0 |
| 0.6923611111111111 | 0 |
| 0.6930555555555555 | 0 |
| 0.69375 | 0 |
| 0.6944444444444445 | 0 |
| 0.6951388888888889 | 0 |
| 0.6958333333333333 | 0 |
| 0.6965277777777777 | 0 |
| 0.6972222222222223 | 0 |
| 0.6979166666666666 | 0 |
| 0.6986111111111111 | 0 |
| 0.6993055555555556 | 0 |
| 0.7000000000000001 | 0 |
| 0.7006944444444444 | 0 |
| 0.7013888888888888 | 0 |
| 0.7020833333333334 | 0 |
| 0.7027777777777778 | 0 |
| 0.7034722222222222 | 0 |
| 0.7041666666666666 | 0 |
| 0.7048611111111112 | 0 |
| 0.7055555555555556 | 0 |
| 0.7062499999999999 | 0 |
| 0.7069444444444444 | 0 |
| 0.7076388888888889 | 0 |
| 0.7083333333333334 | 0 |
| 0.7090277777777777 | 0 |
| 0.7097222222222223 | 0 |
| 0.7104166666666667 | 0 |
| 0.7111111111111111 | 0 |
| 0.7118055555555555 | 0 |
| 0.7125 | 0 |
| 0.7131944444444445 | 0 |
| 0.7138888888888889 | 0 |
| 0.7145833333333332 | 0 |
| 0.7152777777777778 | 0 |
| 0.7159722222222222 | 0 |
| 0.7166666666666667 | 0 |
| 0.717361111111111 | 0 |
| 0.7180555555555556 | 0 |
| 0.71875 | 0 |
| 0.7194444444444444 | 0 |
| 0.720138888888889 | 0 |
| 0.7208333333333333 | 0 |
| 0.7215277777777778 | 0 |
| 0.7222222222222222 | 0 |
| 0.7229166666666668 | 0 |
| 0.7236111111111111 | 0 |
| 0.7243055555555555 | 0 |
| 0.725 | 0 |
| 0.7256944444444445 | 0 |
| 0.7263888888888889 | 0 |
| 0.7270833333333333 | 0 |
| 0.7277777777777777 | 0 |
| 0.7284722222222223 | 0 |
| 0.7291666666666666 | 0 |
| 0.7298611111111111 | 0 |
| 0.7305555555555556 | 0 |
| 0.7312500000000001 | 0 |
| 0.7319444444444444 | 0 |
| 0.7326388888888888 | 0 |
| 0.7333333333333334 | 0 |
| 0.7340277777777778 | 0 |
| 0.7347222222222222 | 0 |
| 0.7354166666666666 | 0 |
| 0.7361111111111112 | 0 |
| 0.7368055555555556 | 0 |
| 0.7374999999999999 | 0 |
| 0.7381944444444444 | 0 |
| 0.7388888888888889 | 0 |
| 0.7395833333333334 | 0 |
| 0.7402777777777777 | 0 |
| 0.7409722222222223 | 0 |
| 0.7416666666666667 | 0 |
| 0.7423611111111111 | 0 |
| 0.7430555555555555 | 0 |
| 0.74375 | 0 |
| 0.7444444444444445 | 0 |
| 0.7451388888888889 | 0 |
| 0.7458333333333332 | 0 |
| 0.7465277777777778 | 0 |
| 0.7472222222222222 | 0 |
| 0.7479166666666667 | 0 |
| 0.748611111111111 | 0 |
| 0.7493055555555556 | 0 |
| 0.75 | 0 |
| 0.7506944444444444 | 0 |
| 0.751388888888889 | 0 |
| 0.7520833333333333 | 0 |
| 0.7527777777777778 | 0 |
| 0.7534722222222222 | 0 |
| 0.7541666666666668 | 0 |
| 0.7548611111111111 | 0 |
| 0.7555555555555555 | 0 |
| 0.75625 | 0 |
| 0.7569444444444445 | 0 |
| 0.7576388888888889 | 0 |
| 0.7583333333333333 | 0 |
| 0.7590277777777777 | 0 |
| 0.7597222222222223 | 0 |
| 0.7604166666666666 | 0 |
| 0.7611111111111111 | 0 |
| 0.7618055555555556 | 0 |
| 0.7625000000000001 | 0 |
| 0.7631944444444444 | 0 |
| 0.7638888888888888 | 0 |
| 0.7645833333333334 | 0 |
| 0.7652777777777778 | 0 |
| 0.7659722222222222 | 0 |
| 0.7666666666666666 | 0 |
| 0.7673611111111112 | 0 |
| 0.7680555555555556 | 0 |
| 0.7687499999999999 | 0 |
| 0.7694444444444444 | 0 |
| 0.7701388888888889 | 0 |
| 0.7708333333333334 | 0 |
| 0.7715277777777777 | 0 |
| 0.7722222222222223 | 0 |
| 0.7729166666666667 | 0 |
| 0.7736111111111111 | 0 |
| 0.7743055555555555 | 0 |
| 0.775 | 0 |
| 0.7756944444444445 | 0 |
| 0.7763888888888889 | 0 |
| 0.7770833333333332 | 0 |
| 0.7777777777777778 | 0 |
| 0.7784722222222222 | 0 |
| 0.7791666666666667 | 0 |
| 0.779861111111111 | 0 |
| 0.7805555555555556 | 0 |
| 0.78125 | 0 |
| 0.7819444444444444 | 0 |
| 0.782638888888889 | 0 |
| 0.7833333333333333 | 0 |
| 0.7840277777777778 | 0 |
| 0.7847222222222222 | 0 |
| 0.7854166666666668 | 0 |
| 0.7861111111111111 | 0 |
| 0.7868055555555555 | 0 |
| 0.7875 | 0 |
| 0.7881944444444445 | 0 |
| 0.7888888888888889 | 0 |
| 0.7895833333333333 | 0 |
| 0.7902777777777777 | 0 |
| 0.7909722222222223 | 0 |
| 0.7916666666666666 | 0 |
| 0.7923611111111111 | 0 |
| 0.7930555555555556 | 0 |
| 0.7937500000000001 | 0 |
| 0.7944444444444444 | 0 |
| 0.7951388888888888 | 0 |
| 0.7958333333333334 | 0 |
| 0.7965277777777778 | 0 |
| 0.7972222222222222 | 0 |
| 0.7979166666666666 | 0 |
| 0.7986111111111112 | 0 |
| 0.7993055555555556 | 0 |
| 0.7999999999999999 | 0 |
| 0.8006944444444444 | 0 |
| 0.8013888888888889 | 0 |
| 0.8020833333333334 | 0 |
| 0.8027777777777777 | 0 |
| 0.8034722222222223 | 0 |
| 0.8041666666666667 | 0 |
| 0.8048611111111111 | 0 |
| 0.8055555555555555 | 0 |
| 0.80625 | 0 |
| 0.8069444444444445 | 0 |
| 0.8076388888888889 | 0 |
| 0.8083333333333332 | 0 |
| 0.8090277777777778 | 0 |
| 0.8097222222222222 | 0 |
| 0.8104166666666667 | 0 |
| 0.811111111111111 | 0 |
| 0.8118055555555556 | 0 |
| 0.8125 | 0 |
| 0.8131944444444444 | 0 |
| 0.813888888888889 | 0 |
| 0.8145833333333333 | 0 |
| 0.8152777777777778 | 0 |
| 0.8159722222222222 | 0 |
| 0.8166666666666668 | 0 |
| 0.8173611111111111 | 0 |
| 0.8180555555555555 | 0 |
| 0.81875 | 0 |
| 0.8194444444444445 | 0 |
| 0.8201388888888889 | 0 |
| 0.8208333333333333 | 0 |
| 0.8215277777777777 | 0 |
| 0.8222222222222223 | 0 |
| 0.8229166666666666 | 0 |
| 0.8236111111111111 | 0 |
| 0.8243055555555556 | 0 |
| 0.8250000000000001 | 0 |
| 0.8256944444444444 | 0 |
| 0.8263888888888888 | 0 |
| 0.8270833333333334 | 0 |
| 0.8277777777777778 | 0 |
| 0.8284722222222222 | 0 |
| 0.8291666666666666 | 0 |
| 0.8298611111111112 | 0 |
| 0.8305555555555556 | 0 |
| 0.8312499999999999 | 0 |
| 0.8319444444444444 | 0 |
| 0.8326388888888889 | 0 |
| 0.8333333333333334 | 0 |
| 0.8340277777777777 | 0 |
| 0.8347222222222223 | 0 |
| 0.8354166666666667 | 0 |
| 0.8361111111111111 | 0 |
| 0.8368055555555555 | 0 |
| 0.8375 | 0 |
| 0.8381944444444445 | 0 |
| 0.8388888888888889 | 0 |
| 0.8395833333333332 | 0 |
| 0.8402777777777778 | 0 |
| 0.8409722222222222 | 0 |
| 0.8416666666666667 | 0 |
| 0.842361111111111 | 0 |
| 0.8430555555555556 | 0 |
| 0.84375 | 0 |
| 0.8444444444444444 | 0 |
| 0.845138888888889 | 0 |
| 0.8458333333333333 | 0 |
| 0.8465277777777778 | 0 |
| 0.8472222222222222 | 0 |
| 0.8479166666666668 | 0 |
| 0.8486111111111111 | 0 |
| 0.8493055555555555 | 0 |
| 0.85 | 0 |
| 0.8506944444444445 | 0 |
| 0.8513888888888889 | 0 |
| 0.8520833333333333 | 0 |
| 0.8527777777777777 | 0 |
| 0.8534722222222223 | 0 |
| 0.8541666666666666 | 0 |
| 0.8548611111111111 | 0 |
| 0.8555555555555556 | 0 |
| 0.8562500000000001 | 0 |
| 0.8569444444444444 | 0 |
| 0.8576388888888888 | 0 |
| 0.8583333333333334 | 0 |
| 0.8590277777777778 | 0 |
| 0.8597222222222222 | 0 |
| 0.8604166666666666 | 0 |
| 0.8611111111111112 | 0 |
| 0.8618055555555556 | 0 |
| 0.8624999999999999 | 0 |
| 0.8631944444444444 | 0 |
| 0.8638888888888889 | 0 |
| 0.8645833333333334 | 0 |
| 0.8652777777777777 | 0 |
| 0.8659722222222223 | 0 |
| 0.8666666666666667 | 0 |
| 0.8673611111111111 | 0 |
| 0.8680555555555555 | 0 |
| 0.86875 | 0 |
| 0.8694444444444445 | 0 |
| 0.8701388888888889 | 0 |
| 0.8708333333333332 | 0 |
| 0.8715277777777778 | 0 |
| 0.8722222222222222 | 0 |
| 0.8729166666666667 | 0 |
| 0.873611111111111 | 0 |
| 0.8743055555555556 | 0 |
| 0.875 | 0 |
| 0.8756944444444444 | 0 |
| 0.876388888888889 | 0 |
| 0.8770833333333333 | 0 |
| 0.8777777777777778 | 0 |
| 0.8784722222222222 | 0 |
| 0.8791666666666668 | 0 |
| 0.8798611111111111 | 0 |
| 0.8805555555555555 | 0 |
| 0.88125 | 0 |
| 0.8819444444444445 | 0 |
| 0.8826388888888889 | 0 |
| 0.8833333333333333 | 0 |
| 0.8840277777777777 | 0 |
| 0.8847222222222223 | 0 |
| 0.8854166666666666 | 0 |
| 0.8861111111111111 | 0 |
| 0.8868055555555556 | 0 |
| 0.8875000000000001 | 0 |
| 0.8881944444444444 | 0 |
| 0.8888888888888888 | 0 |
| 0.8895833333333334 | 0 |
| 0.8902777777777778 | 0 |
| 0.8909722222222222 | 0 |
| 0.8916666666666666 | 0 |
| 0.8923611111111112 | 0 |
| 0.8930555555555556 | 0 |
| 0.8937499999999999 | 0 |
| 0.8944444444444444 | 0 |
| 0.8951388888888889 | 0 |
| 0.8958333333333334 | 0 |
| 0.8965277777777777 | 0 |
| 0.8972222222222223 | 0 |
| 0.8979166666666667 | 0 |
| 0.8986111111111111 | 0 |
| 0.8993055555555555 | 0 |
| 0.9 | 0 |
| 0.9006944444444445 | 0 |
| 0.9013888888888889 | 0 |
| 0.9020833333333332 | 0 |
| 0.9027777777777778 | 0 |
| 0.9034722222222222 | 0 |
| 0.9041666666666667 | 0 |
| 0.904861111111111 | 0 |
| 0.9055555555555556 | 0 |
| 0.90625 | 0 |
| 0.9069444444444444 | 0 |
| 0.907638888888889 | 0 |
| 0.9083333333333333 | 0 |
| 0.9090277777777778 | 0 |
| 0.9097222222222222 | 0 |
| 0.9104166666666668 | 0 |
| 0.9111111111111111 | 0 |
| 0.9118055555555555 | 0 |
| 0.9125 | 0 |
| 0.9131944444444445 | 0 |
| 0.9138888888888889 | 0 |
| 0.9145833333333333 | 0 |
| 0.9152777777777777 | 0 |
| 0.9159722222222223 | 0 |
| 0.9166666666666666 | 0 |
| 0.9173611111111111 | 0 |
| 0.9180555555555556 | 0 |
| 0.9187500000000001 | 0 |
| 0.9194444444444444 | 0 |
| 0.9201388888888888 | 0 |
| 0.9208333333333334 | 0 |
| 0.9215277777777778 | 0 |
| 0.9222222222222222 | 0 |
| 0.9229166666666666 | 0 |
| 0.9236111111111112 | 0 |
| 0.9243055555555556 | 0 |
| 0.9249999999999999 | 0 |
| 0.9256944444444444 | 0 |
| 0.9263888888888889 | 0 |
| 0.9270833333333334 | 0 |
| 0.9277777777777777 | 0 |
| 0.9284722222222223 | 0 |
| 0.9291666666666667 | 0 |
| 0.9298611111111111 | 0 |
| 0.9305555555555555 | 0 |
| 0.93125 | 0 |
| 0.9319444444444445 | 0 |
| 0.9326388888888889 | 0 |
| 0.9333333333333332 | 0 |
| 0.9340277777777778 | 0 |
| 0.9347222222222222 | 0 |
| 0.9354166666666667 | 0 |
| 0.936111111111111 | 0 |
| 0.9368055555555556 | 0 |
| 0.9375 | 0 |
| 0.9381944444444444 | 0 |
| 0.938888888888889 | 0 |
| 0.9395833333333333 | 0 |
| 0.9402777777777778 | 0 |
| 0.9409722222222222 | 0 |
| 0.9416666666666668 | 0 |
| 0.9423611111111111 | 0 |
| 0.9430555555555555 | 0 |
| 0.94375 | 0 |
| 0.9444444444444445 | 0 |
| 0.9451388888888889 | 0 |
| 0.9458333333333333 | 0 |
| 0.9465277777777777 | 0 |
| 0.9472222222222223 | 0 |
| 0.9479166666666666 | 0 |
| 0.9486111111111111 | 0 |
| 0.9493055555555556 | 0 |
| 0.9500000000000001 | 0 |
| 0.9506944444444444 | 0 |
| 0.9513888888888888 | 0 |
| 0.9520833333333334 | 0 |
| 0.9527777777777778 | 0 |
| 0.9534722222222222 | 0 |
| 0.9541666666666666 | 0 |
| 0.9548611111111112 | 0 |
| 0.9555555555555556 | 0 |
| 0.9562499999999999 | 0 |
| 0.9569444444444444 | 0 |
| 0.9576388888888889 | 0 |
| 0.9583333333333334 | 0 |
| 0.9590277777777777 | 0 |
| 0.9597222222222223 | 0 |
| 0.9604166666666667 | 0 |
| 0.9611111111111111 | 0 |
| 0.9618055555555555 | 0 |
| 0.9625 | 0 |
| 0.9631944444444445 | 0 |
| 0.9638888888888889 | 0 |
| 0.9645833333333332 | 0 |
| 0.9652777777777778 | 0 |
| 0.9659722222222222 | 0 |
| 0.9666666666666667 | 0 |
| 0.967361111111111 | 0 |
| 0.9680555555555556 | 0 |
| 0.96875 | 0 |
| 0.9694444444444444 | 0 |
| 0.970138888888889 | 0 |
| 0.9708333333333333 | 0 |
| 0.9715277777777778 | 0 |
| 0.9722222222222222 | 0 |
| 0.9729166666666668 | 0 |
| 0.9736111111111111 | 0 |
| 0.9743055555555555 | 0 |
| 0.975 | 0 |
| 0.9756944444444445 | 0 |
| 0.9763888888888889 | 0 |
| 0.9770833333333333 | 0 |
| 0.9777777777777777 | 0 |
| 0.9784722222222223 | 0 |
| 0.9791666666666666 | 0 |
| 0.9798611111111111 | 0 |
| 0.9805555555555556 | 0 |
| 0.9812500000000001 | 0 |
| 0.9819444444444444 | 0 |
| 0.9826388888888888 | 0 |
| 0.9833333333333334 | 0 |
| 0.9840277777777778 | 0 |
| 0.9847222222222222 | 0 |
| 0.9854166666666666 | 0 |
| 0.9861111111111112 | 0 |
| 0.9868055555555556 | 0 |
| 0.9874999999999999 | 0 |
| 0.9881944444444444 | 0 |
| 0.9888888888888889 | 0 |
| 0.9895833333333334 | 0 |
| 0.9902777777777777 | 0 |
| 0.9909722222222223 | 0 |
| 0.9916666666666667 | 0 |
| 0.9923611111111111 | 0 |
| 0.9930555555555555 | 0 |
| 0.99375 | 0 |
| 0.9944444444444445 | 0 |
| 0.9951388888888889 | 0 |
| 0.9958333333333332 | 0 |
| 0.9965277777777778 | 0 |
| 0.9972222222222222 | 0 |
| 0.9979166666666667 | 0 |
| 0.998611111111111 | 0 |
| 0.9993055555555556 | 0 |